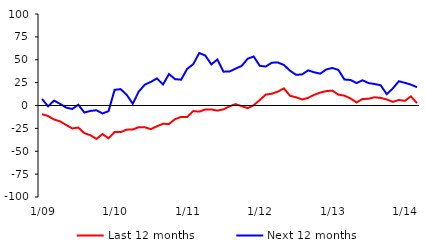
| Category | Last 12 months | Next 12 months |
|---|---|---|
|  1/09 | -9.4 | 7.1 |
|  2/09 | -11.5 | -0.9 |
|  3/09 | -15.3 | 5.4 |
|  4/09 | -17.4 | 1.7 |
|  5/09 | -21.3 | -2.3 |
|  6/09 | -25.1 | -3.8 |
|  7/09 | -24.1 | 0.9 |
|  8/09 | -30.2 | -7.7 |
|  9/09 | -32.5 | -5.9 |
|  10/09 | -36.5 | -5.2 |
|  11/09 | -31.2 | -8.7 |
|  12/09 | -35.8 | -6.2 |
|  1/10 | -29 | 17.1 |
|  2/10 | -29.1 | 17.9 |
|  3/10 | -26.4 | 11.7 |
|  4/10 | -26.2 | 1.9 |
|  5/10 | -23.7 | 15.3 |
|  6/10 | -23.8 | 22.8 |
|  7/10 | -25.8 | 25.8 |
|  8/10 | -22.7 | 29.6 |
|  9/10 | -20 | 22.9 |
|  10/10 | -20.2 | 34.4 |
|  11/10 | -14.9 | 28.8 |
|  12/10 | -12.5 | 28.2 |
|  1/11 | -12.6 | 40.1 |
|  2/11 | -6.1 | 45.1 |
|  3/11 | -6.7 | 57.4 |
|  4/11 | -4.3 | 54.6 |
|  5/11 | -4.3 | 44.9 |
|  6/11 | -5.6 | 50.3 |
|  7/11 | -4.2 | 37 |
|  8/11 | -0.9 | 37.1 |
|  9/11 | 1.5 | 40.3 |
|  10/11 | -0.7 | 43.2 |
|  11/11 | -2.9 | 51.1 |
|  12/11 | 0.4 | 53.6 |
|  1/12 | 5.9 | 43.4 |
|  2/12 | 11.9 | 42.6 |
|  3/12 | 12.9 | 46.8 |
|  4/12 | 15.2 | 47 |
|  5/12 | 18.7 | 44.3 |
|  6/12 | 10.6 | 38.1 |
|  7/12 | 9 | 33.5 |
|  8/12 | 6.6 | 34 |
|  9/12 | 8.3 | 38.4 |
|  10/12 | 11.7 | 36.3 |
|  11/12 | 14.1 | 34.8 |
|  12/12 | 15.7 | 39.4 |
|  1/13 | 16.3 | 41 |
|  2/13 | 11.9 | 38.9 |
|  3/13 | 10.8 | 28.4 |
|  4/13 | 7.7 | 27.9 |
|  5/13 | 3.3 | 24.5 |
|  6/13 | 7.1 | 27.6 |
|  7/13 | 7.4 | 24.5 |
|  8/13 | 9 | 23.5 |
|  9/13 | 8.3 | 22.1 |
|  10/13 | 6.6 | 12.4 |
|  11/13 | 4 | 18.6 |
|  12/13 | 6 | 26.5 |
|  1/14 | 5.1 | 24.8 |
|  2/14 | 10 | 22.8 |
|  3/14 | 2.6 | 20 |